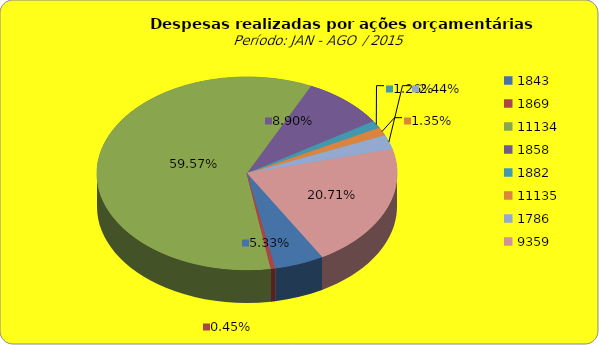
| Category | Series 1 |
|---|---|
| 1843.0 | 8197055.96 |
| 1869.0 | 688127.47 |
| 11134.0 | 91668025.47 |
| 1858.0 | 13690360.37 |
| 1882.0 | 1934155.05 |
| 11135.0 | 2070365.78 |
| 1786.0 | 3759165.26 |
| 9359.0 | 31871788.33 |